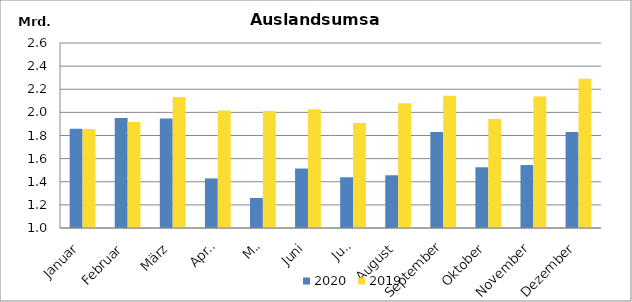
| Category | 2020 | 2019 |
|---|---|---|
| Januar | 1858065.05 | 1856099.682 |
| Februar | 1952341.569 | 1916922.548 |
| März | 1947919.508 | 2132679.947 |
| April | 1428853.282 | 2016903.562 |
| Mai | 1260012.965 | 2010925.095 |
| Juni | 1514377.561 | 2027148.12 |
| Juli | 1438971.786 | 1907418.152 |
| August | 1455979.639 | 2078988.88 |
| September | 1830386.786 | 2144321.367 |
| Oktober | 1525015.577 | 1942144.035 |
| November | 1544441.915 | 2136554.29 |
| Dezember | 1829669.723 | 2290298.221 |